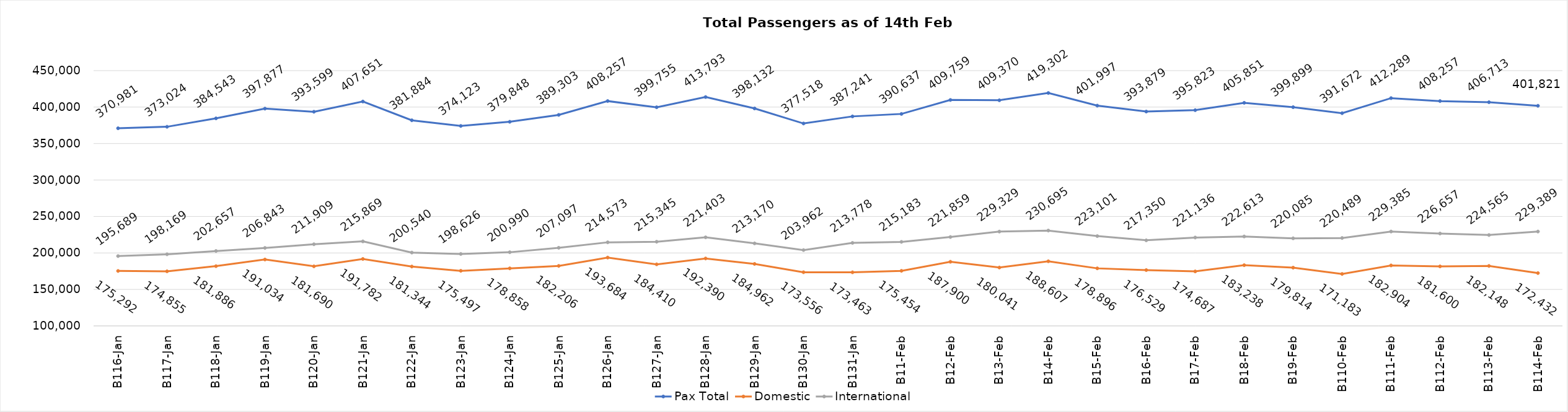
| Category | Pax Total | Domestic | International |
|---|---|---|---|
| 2024-01-16 | 370981 | 175292 | 195689 |
| 2024-01-17 | 373024 | 174855 | 198169 |
| 2024-01-18 | 384543 | 181886 | 202657 |
| 2024-01-19 | 397877 | 191034 | 206843 |
| 2024-01-20 | 393599 | 181690 | 211909 |
| 2024-01-21 | 407651 | 191782 | 215869 |
| 2024-01-22 | 381884 | 181344 | 200540 |
| 2024-01-23 | 374123 | 175497 | 198626 |
| 2024-01-24 | 379848 | 178858 | 200990 |
| 2024-01-25 | 389303 | 182206 | 207097 |
| 2024-01-26 | 408257 | 193684 | 214573 |
| 2024-01-27 | 399755 | 184410 | 215345 |
| 2024-01-28 | 413793 | 192390 | 221403 |
| 2024-01-29 | 398132 | 184962 | 213170 |
| 2024-01-30 | 377518 | 173556 | 203962 |
| 2024-01-31 | 387241 | 173463 | 213778 |
| 2024-02-01 | 390637 | 175454 | 215183 |
| 2024-02-02 | 409759 | 187900 | 221859 |
| 2024-02-03 | 409370 | 180041 | 229329 |
| 2024-02-04 | 419302 | 188607 | 230695 |
| 2024-02-05 | 401997 | 178896 | 223101 |
| 2024-02-06 | 393879 | 176529 | 217350 |
| 2024-02-07 | 395823 | 174687 | 221136 |
| 2024-02-08 | 405851 | 183238 | 222613 |
| 2024-02-09 | 399899 | 179814 | 220085 |
| 2024-02-10 | 391672 | 171183 | 220489 |
| 2024-02-11 | 412289 | 182904 | 229385 |
| 2024-02-12 | 408257 | 181600 | 226657 |
| 2024-02-13 | 406713 | 182148 | 224565 |
| 2024-02-14 | 401821 | 172432 | 229389 |